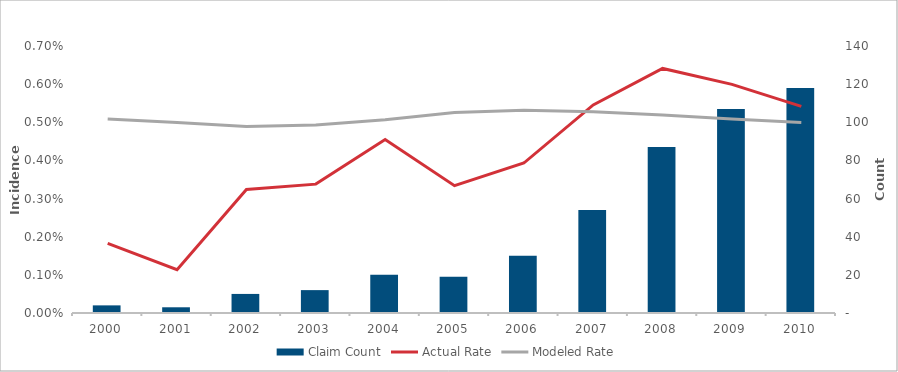
| Category | Claim Count |
|---|---|
| 2000.0 | 4 |
| 2001.0 | 3 |
| 2002.0 | 10 |
| 2003.0 | 12 |
| 2004.0 | 20 |
| 2005.0 | 19 |
| 2006.0 | 30 |
| 2007.0 | 54 |
| 2008.0 | 87 |
| 2009.0 | 107 |
| 2010.0 | 118 |